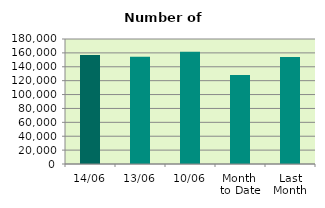
| Category | Series 0 |
|---|---|
| 14/06 | 156912 |
| 13/06 | 154294 |
| 10/06 | 161540 |
| Month 
to Date | 128267 |
| Last
Month | 154240.182 |